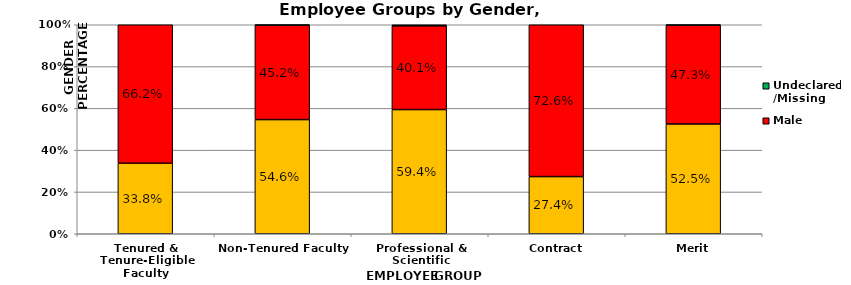
| Category | Female | Male | Undeclared/Missing |
|---|---|---|---|
| Tenured & Tenure-Eligible Faculty | 0.338 | 0.662 | 0 |
| Non-Tenured Faculty | 0.546 | 0.452 | 0.002 |
| Professional & Scientific | 0.594 | 0.401 | 0.005 |
| Contract | 0.274 | 0.726 | 0 |
| Merit | 0.525 | 0.473 | 0.002 |